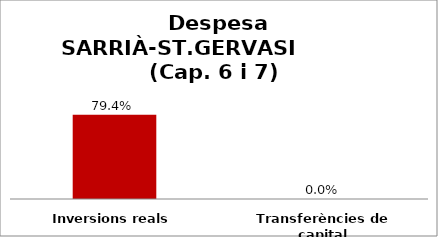
| Category | Series 0 |
|---|---|
| Inversions reals | 0.794 |
| Transferències de capital | 0 |